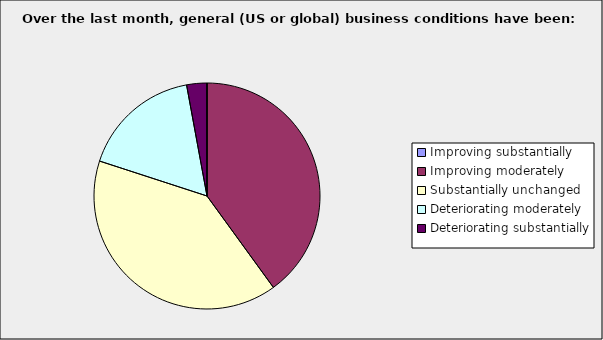
| Category | Series 0 |
|---|---|
| Improving substantially | 0 |
| Improving moderately | 0.4 |
| Substantially unchanged | 0.4 |
| Deteriorating moderately | 0.171 |
| Deteriorating substantially | 0.029 |